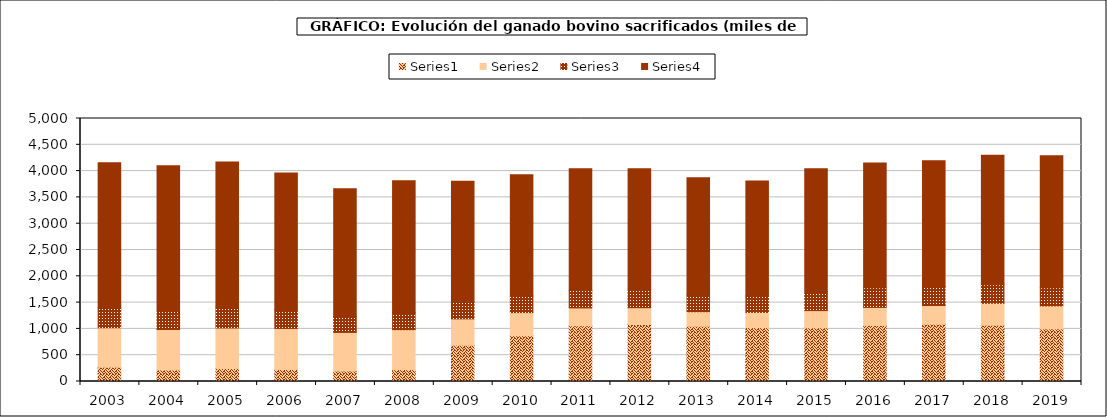
| Category | Series 0 | Series 1 | Series 2 | Series 3 |
|---|---|---|---|---|
| 2003.0 | 269.48 | 751.965 | 374.846 | 2763.095 |
| 2004.0 | 220.638 | 767.767 | 380.128 | 2732.046 |
| 2005.0 | 246.944 | 769.645 | 400.576 | 2757.558 |
| 2006.0 | 227.871 | 780.95 | 355.484 | 2599.095 |
| 2007.0 | 197.822 | 735.107 | 301.795 | 2427.983 |
| 2008.0 | 225.783 | 758.655 | 323.877 | 2506.734 |
| 2009.0 | 690.106 | 500.364 | 312.199 | 2306.595 |
| 2010.0 | 869.716 | 439.941 | 318.432 | 2302.089 |
| 2011.0 | 1059.2 | 339.951 | 331.79 | 2314.752 |
| 2012.0 | 1083.19 | 319.983 | 353.838 | 2285.924 |
| 2013.0 | 1050.071 | 276.098 | 323.4 | 2222.003 |
| 2014.0 | 1023.638 | 289.637 | 314.523 | 2182.59 |
| 2015.0 | 1021.185 | 326.435 | 364.083 | 2333.895 |
| 2016.0 | 1065.529 | 342.877 | 373.921 | 2373.85 |
| 2017.0 | 1089.661 | 355.447 | 361.984 | 2391.003 |
| 2018.0 | 1069.502 | 416.616 | 352.939 | 2462.557 |
| 2019.0 | 999.724 | 437.599 | 342.647 | 2510.774 |